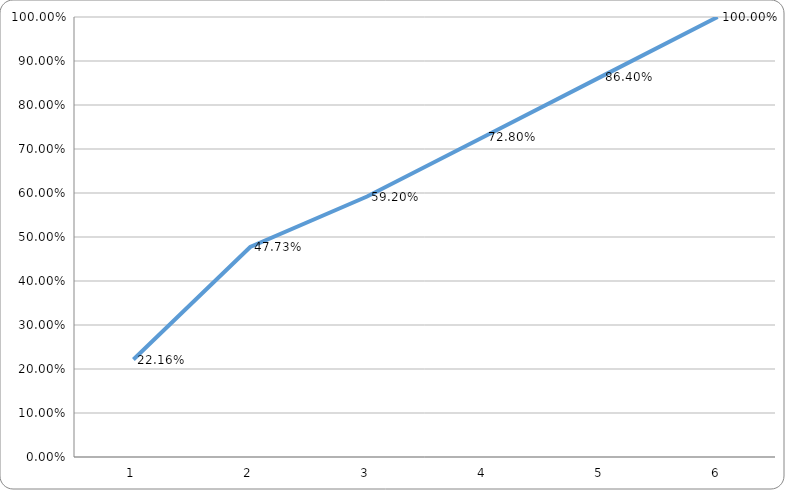
| Category | Series 0 |
|---|---|
| 0 | 0.222 |
| 1 | 0.477 |
| 2 | 0.592 |
| 3 | 0.728 |
| 4 | 0.864 |
| 5 | 1 |